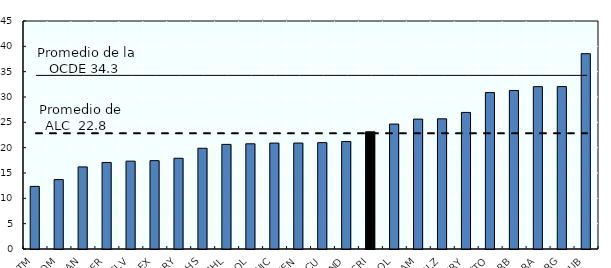
| Category | Relación de ingresos tributarios y el PIB en la región de ALC por países |
|---|---|
| GTM | 12.356 |
| DOM | 13.703 |
| PAN | 16.202 |
| PER | 17.081 |
| SLV | 17.341 |
| MEX | 17.438 |
| PRY | 17.909 |
| BHS | 19.883 |
| CHL | 20.649 |
| COL | 20.761 |
| NIC | 20.905 |
| VEN | 20.913 |
| ECU | 20.995 |
| HND | 21.212 |
| CRI | 23.128 |
| BOL | 24.66 |
| JAM | 25.636 |
| BLZ | 25.693 |
| URY | 26.958 |
| TTO | 30.872 |
| BRB | 31.289 |
| BRA | 32.045 |
| ARG | 32.053 |
| CUB | 38.551 |